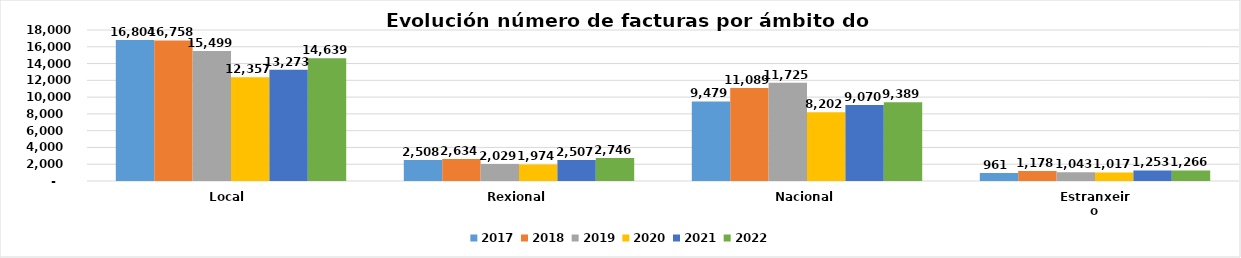
| Category | 2017 | 2018 | 2019 | 2020 | 2021 | 2022 |
|---|---|---|---|---|---|---|
| Local  | 16804 | 16758 | 15499 | 12357 | 13273 | 14639 |
| Rexional | 2508 | 2634 | 2029 | 1974 | 2507 | 2746 |
| Nacional | 9479 | 11089 | 11725 | 8202 | 9070 | 9389 |
| Estranxeiro | 961 | 1178 | 1043 | 1017 | 1253 | 1266 |